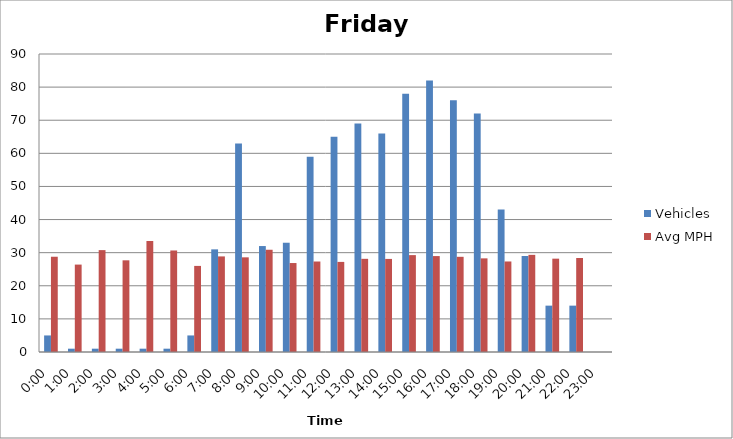
| Category | Vehicles | Avg MPH |
|---|---|---|
| 0:00 | 5 | 28.77 |
| 1:00 | 1 | 26.4 |
| 2:00 | 1 | 30.77 |
| 3:00 | 1 | 27.69 |
| 4:00 | 1 | 33.52 |
| 5:00 | 1 | 30.66 |
| 6:00 | 5 | 26 |
| 7:00 | 31 | 28.87 |
| 8:00 | 63 | 28.59 |
| 9:00 | 32 | 30.88 |
| 10:00 | 33 | 26.87 |
| 11:00 | 59 | 27.33 |
| 12:00 | 65 | 27.21 |
| 13:00 | 69 | 28.14 |
| 14:00 | 66 | 28.11 |
| 15:00 | 78 | 29.26 |
| 16:00 | 82 | 28.97 |
| 17:00 | 76 | 28.75 |
| 18:00 | 72 | 28.28 |
| 19:00 | 43 | 27.34 |
| 20:00 | 29 | 29.34 |
| 21:00 | 14 | 28.19 |
| 22:00 | 14 | 28.39 |
| 23:00 | 0 | 0 |